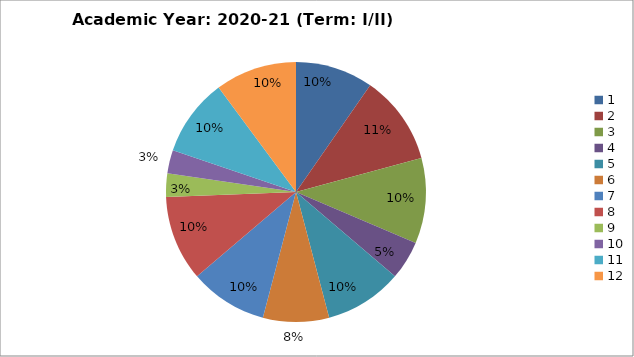
| Category | Series 0 | Series 1 | Series 2 |
|---|---|---|---|
| 0 | 20 | 2 | 1 |
| 1 | 23 | 4 | 0 |
| 2 | 22 | 2 | 2 |
| 3 | 10 | 15 | 0 |
| 4 | 20 | 7 | 6 |
| 5 | 17 | 4 | 4 |
| 6 | 20 | 7 | 2 |
| 7 | 22 | 3 | 2 |
| 8 | 6 | 17 | 2 |
| 9 | 6 | 8 | 9 |
| 10 | 20 | 5 | 5 |
| 11 | 21 | 4 | 0 |